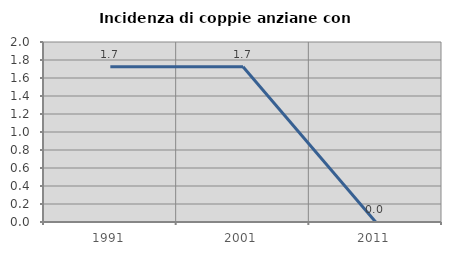
| Category | Incidenza di coppie anziane con figli |
|---|---|
| 1991.0 | 1.724 |
| 2001.0 | 1.724 |
| 2011.0 | 0 |